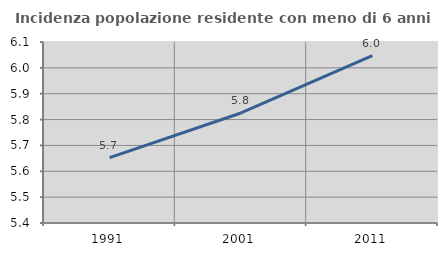
| Category | Incidenza popolazione residente con meno di 6 anni |
|---|---|
| 1991.0 | 5.653 |
| 2001.0 | 5.825 |
| 2011.0 | 6.047 |